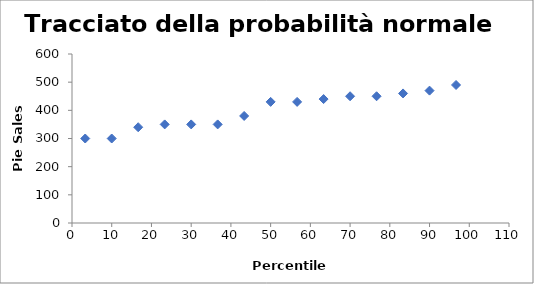
| Category | Series 0 |
|---|---|
| 3.3333333333333335 | 300 |
| 10.0 | 300 |
| 16.666666666666668 | 340 |
| 23.333333333333332 | 350 |
| 30.0 | 350 |
| 36.66666666666667 | 350 |
| 43.333333333333336 | 380 |
| 50.00000000000001 | 430 |
| 56.66666666666667 | 430 |
| 63.333333333333336 | 440 |
| 70.0 | 450 |
| 76.66666666666667 | 450 |
| 83.33333333333333 | 460 |
| 90.0 | 470 |
| 96.66666666666667 | 490 |